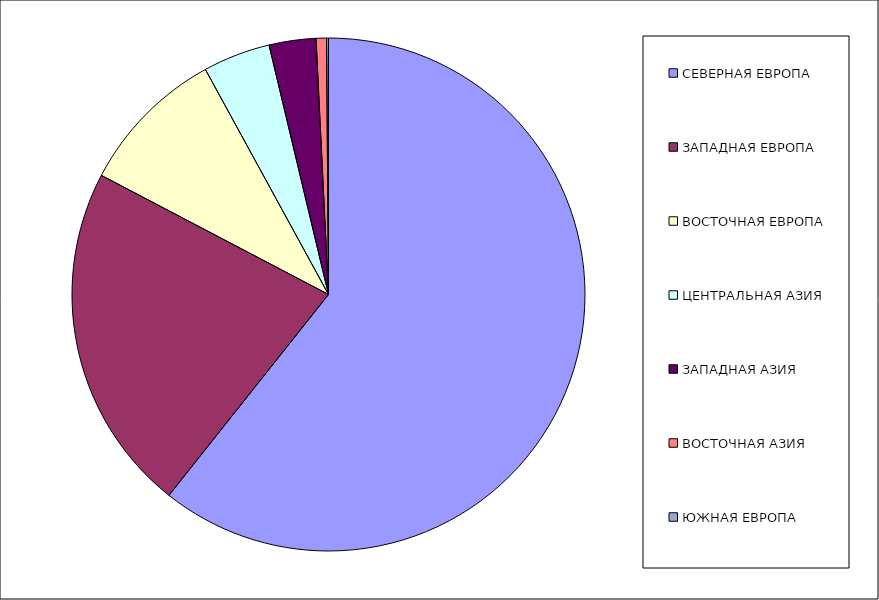
| Category | Оборот |
|---|---|
| СЕВЕРНАЯ ЕВРОПА | 60.685 |
| ЗАПАДНАЯ ЕВРОПА | 22.003 |
| ВОСТОЧНАЯ ЕВРОПА | 9.344 |
| ЦЕНТРАЛЬНАЯ АЗИЯ | 4.242 |
| ЗАПАДНАЯ АЗИЯ | 2.95 |
| ВОСТОЧНАЯ АЗИЯ | 0.654 |
| ЮЖНАЯ ЕВРОПА | 0.122 |